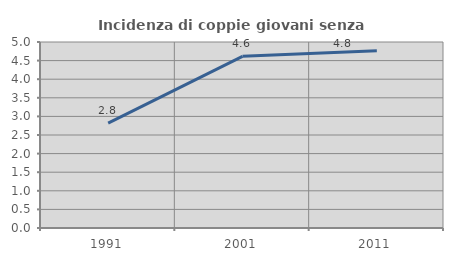
| Category | Incidenza di coppie giovani senza figli |
|---|---|
| 1991.0 | 2.817 |
| 2001.0 | 4.615 |
| 2011.0 | 4.762 |